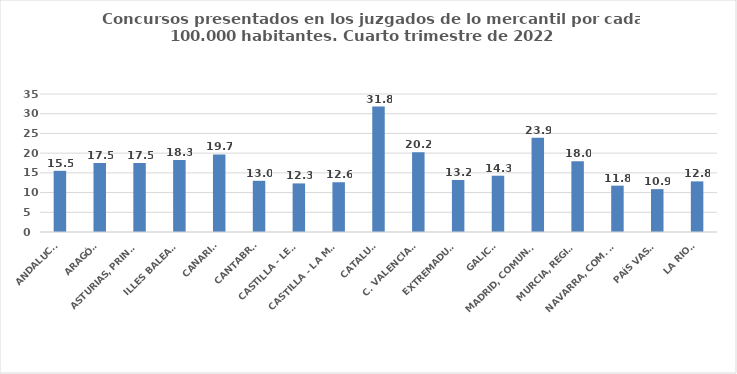
| Category | Series 0 |
|---|---|
| ANDALUCÍA | 15.516 |
| ARAGÓN | 17.505 |
| ASTURIAS, PRINCIPADO | 17.521 |
| ILLES BALEARS | 18.278 |
| CANARIAS | 19.665 |
| CANTABRIA | 12.987 |
| CASTILLA - LEÓN | 12.32 |
| CASTILLA - LA MANCHA | 12.621 |
| CATALUÑA | 31.799 |
| C. VALENCIANA | 20.232 |
| EXTREMADURA | 13.185 |
| GALICIA | 14.28 |
| MADRID, COMUNIDAD | 23.916 |
| MURCIA, REGIÓN | 17.957 |
| NAVARRA, COM. FORAL | 11.754 |
| PAÍS VASCO | 10.873 |
| LA RIOJA | 12.833 |